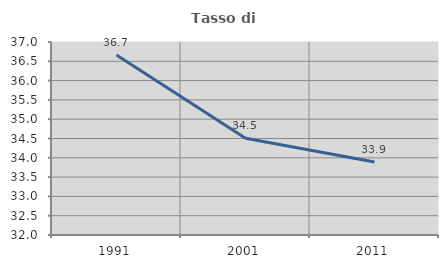
| Category | Tasso di occupazione   |
|---|---|
| 1991.0 | 36.663 |
| 2001.0 | 34.506 |
| 2011.0 | 33.893 |